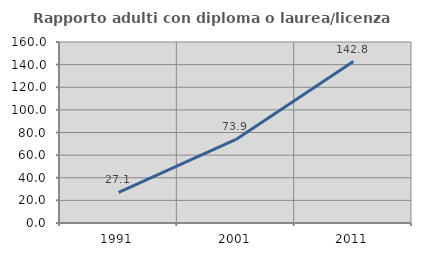
| Category | Rapporto adulti con diploma o laurea/licenza media  |
|---|---|
| 1991.0 | 27.068 |
| 2001.0 | 73.885 |
| 2011.0 | 142.754 |